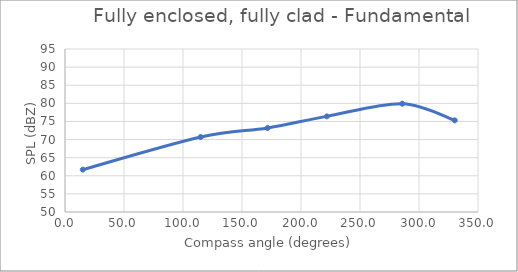
| Category | Series 0 |
|---|---|
| 15.06445125542554 | 61.7 |
| 115.00449447818254 | 70.7 |
| 171.7068171198818 | 73.2 |
| 221.8691292075067 | 76.4 |
| 285.7828166838848 | 79.9 |
| 330.28010595813004 | 75.3 |